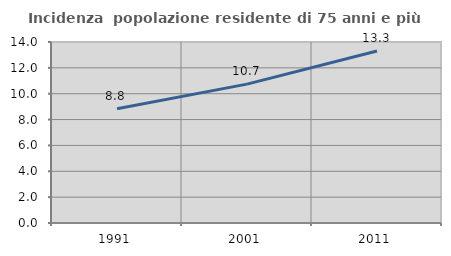
| Category | Incidenza  popolazione residente di 75 anni e più |
|---|---|
| 1991.0 | 8.844 |
| 2001.0 | 10.742 |
| 2011.0 | 13.3 |